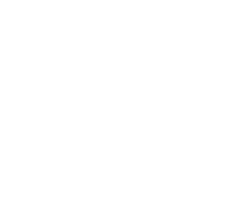
| Category | Series 0 |
|---|---|
| Transportation | 0 |
| Lodging | 0 |
| Food | 0 |
| Other | 0 |